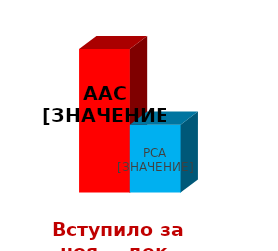
| Category | ААС | РСА |
|---|---|---|
| 0 | 558 | 264 |